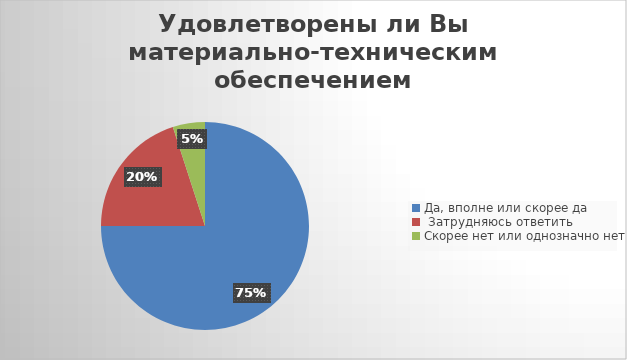
| Category | Series 0 |
|---|---|
| Да, вполне или скорее да | 0.75 |
|  Затрудняюсь ответить | 0.2 |
| Скорее нет или однозначно нет | 0.05 |